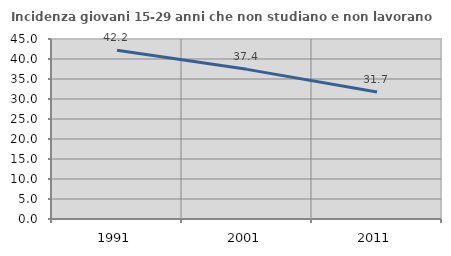
| Category | Incidenza giovani 15-29 anni che non studiano e non lavorano  |
|---|---|
| 1991.0 | 42.169 |
| 2001.0 | 37.412 |
| 2011.0 | 31.731 |